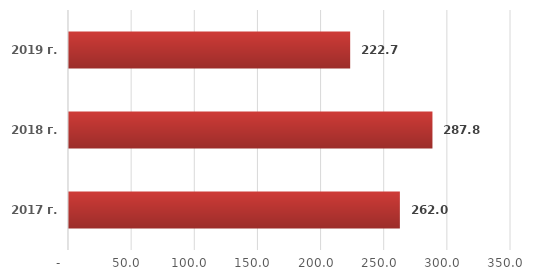
| Category | Series 0 |
|---|---|
| 2017 г. | 262.002 |
| 2018 г. | 287.8 |
| 2019 г. | 222.654 |